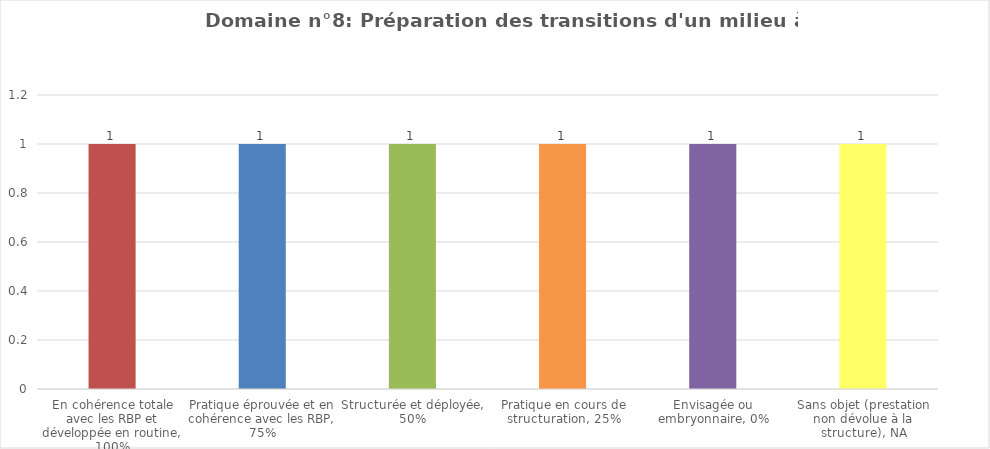
| Category | Domaine n°8: Préparation des transitions d'un milieu à un autre |
|---|---|
| En cohérence totale avec les RBP et développée en routine, 100% | 1 |
| Pratique éprouvée et en cohérence avec les RBP, 75% | 1 |
| Structurée et déployée, 50% | 1 |
| Pratique en cours de structuration, 25% | 1 |
| Envisagée ou embryonnaire, 0% | 1 |
| Sans objet (prestation non dévolue à la structure), NA | 1 |